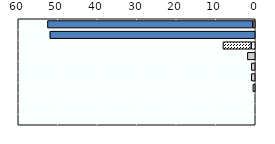
| Category | Paternity leave | Father-specific parental and homecare leave |
|---|---|---|
| Korea | 0.6 | 52 |
| Japan | 0 | 52 |
| OECD average (d) | 1.03 | 7.138 |
| Australia | 2 | 0 |
| Singapore | 1 | 0 |
| Viet Nam | 1 | 0 |
| Hong Kong (China) | 0.6 | 0 |
| China | 0 | 0 |
| New Zealand | 0 | 0 |
| Thailand | 0 | 0 |